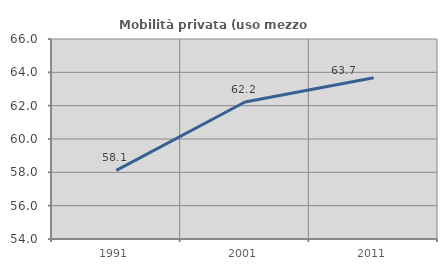
| Category | Mobilità privata (uso mezzo privato) |
|---|---|
| 1991.0 | 58.113 |
| 2001.0 | 62.222 |
| 2011.0 | 63.679 |